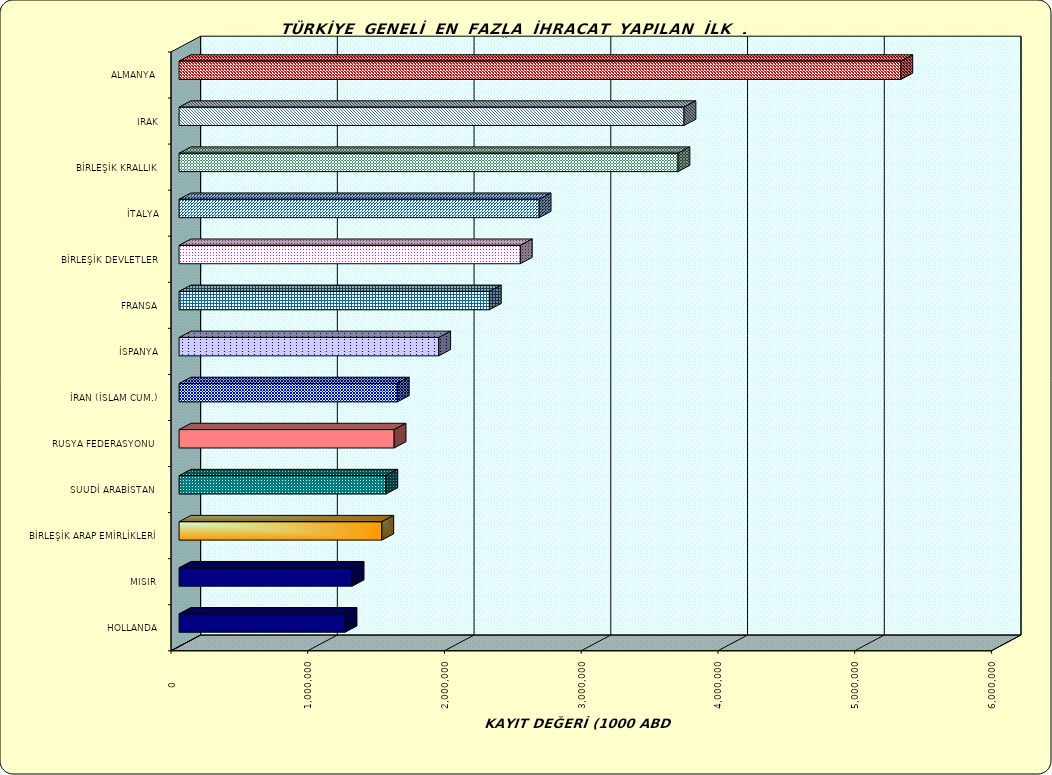
| Category | Series 0 |
|---|---|
| ALMANYA  | 5278896.79 |
| IRAK | 3692994.4 |
| BİRLEŞİK KRALLIK | 3649033.663 |
| İTALYA | 2633530.579 |
| BİRLEŞİK DEVLETLER | 2495901.171 |
| FRANSA | 2269465.5 |
| İSPANYA | 1899195.206 |
| İRAN (İSLAM CUM.) | 1596045.624 |
| RUSYA FEDERASYONU  | 1572973.544 |
| SUUDİ ARABİSTAN  | 1512353.844 |
| BİRLEŞİK ARAP EMİRLİKLERİ | 1482959.017 |
| MISIR  | 1265902.403 |
| HOLLANDA | 1214180.649 |